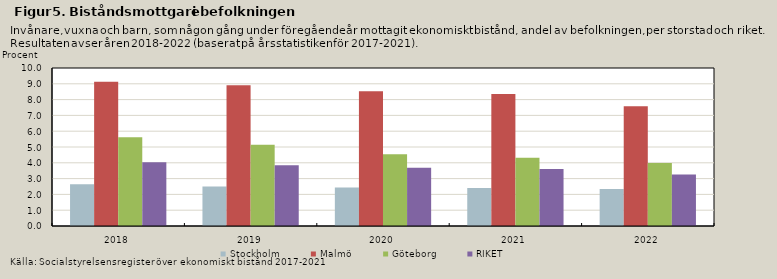
| Category | Stockholm | Malmö | Göteborg | RIKET |
|---|---|---|---|---|
| 2018.0 | 2.649 | 9.134 | 5.618 | 4.032 |
| 2019.0 | 2.499 | 8.91 | 5.149 | 3.848 |
| 2020.0 | 2.439 | 8.524 | 4.547 | 3.691 |
| 2021.0 | 2.403 | 8.358 | 4.322 | 3.604 |
| 2022.0 | 2.346 | 7.585 | 3.995 | 3.259 |